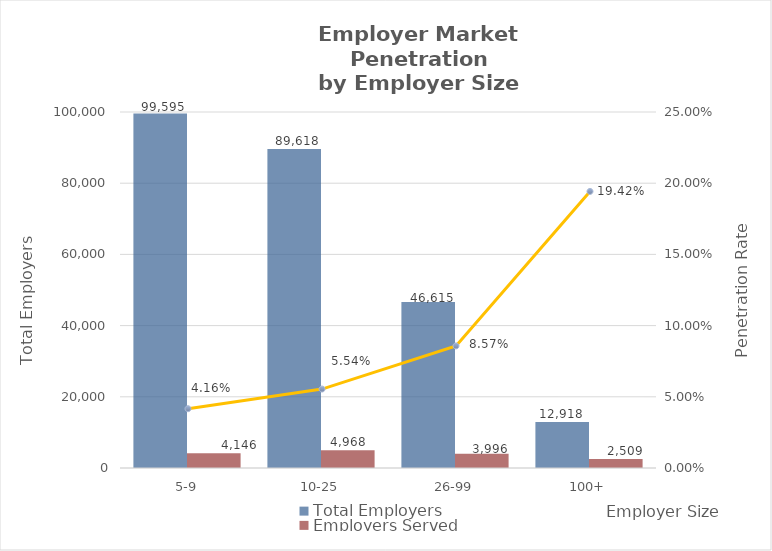
| Category | Total Employers | Employers Served |
|---|---|---|
| 5-9 | 99595 | 4146 |
| 10-25 | 89618 | 4968 |
| 26-99 | 46615 | 3996 |
| 100+ | 12918 | 2509 |